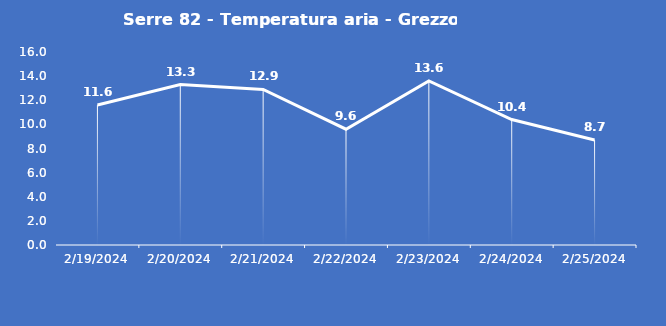
| Category | Serre 82 - Temperatura aria - Grezzo (°C) |
|---|---|
| 2/19/24 | 11.6 |
| 2/20/24 | 13.3 |
| 2/21/24 | 12.9 |
| 2/22/24 | 9.6 |
| 2/23/24 | 13.6 |
| 2/24/24 | 10.4 |
| 2/25/24 | 8.7 |